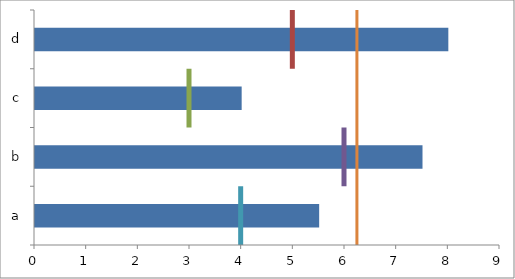
| Category | Data |
|---|---|
| a | 5.5 |
| b | 7.5 |
| c | 4 |
| d | 8 |